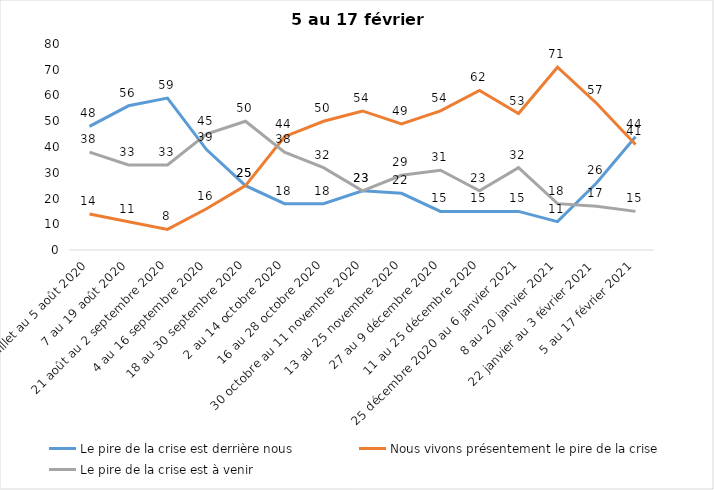
| Category | Le pire de la crise est derrière nous | Nous vivons présentement le pire de la crise | Le pire de la crise est à venir |
|---|---|---|---|
| 24 juillet au 5 août 2020 | 48 | 14 | 38 |
| 7 au 19 août 2020 | 56 | 11 | 33 |
| 21 août au 2 septembre 2020 | 59 | 8 | 33 |
| 4 au 16 septembre 2020 | 39 | 16 | 45 |
| 18 au 30 septembre 2020 | 25 | 25 | 50 |
| 2 au 14 octobre 2020 | 18 | 44 | 38 |
| 16 au 28 octobre 2020 | 18 | 50 | 32 |
| 30 octobre au 11 novembre 2020 | 23 | 54 | 23 |
| 13 au 25 novembre 2020 | 22 | 49 | 29 |
| 27 au 9 décembre 2020 | 15 | 54 | 31 |
| 11 au 25 décembre 2020 | 15 | 62 | 23 |
| 25 décembre 2020 au 6 janvier 2021 | 15 | 53 | 32 |
| 8 au 20 janvier 2021 | 11 | 71 | 18 |
| 22 janvier au 3 février 2021 | 26 | 57 | 17 |
| 5 au 17 février 2021 | 44 | 41 | 15 |